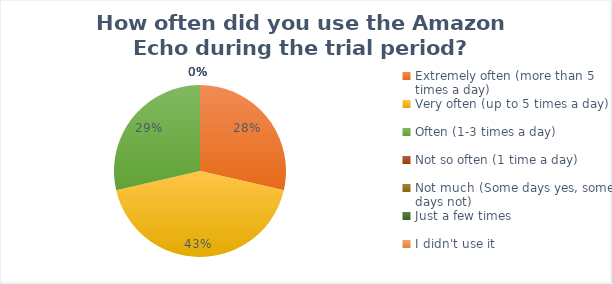
| Category | Series 0 |
|---|---|
| Extremely often (more than 5 times a day) | 2 |
| Very often (up to 5 times a day) | 3 |
| Often (1-3 times a day) | 2 |
| Not so often (1 time a day) | 0 |
| Not much (Some days yes, some days not) | 0 |
| Just a few times | 0 |
| I didn't use it | 0 |